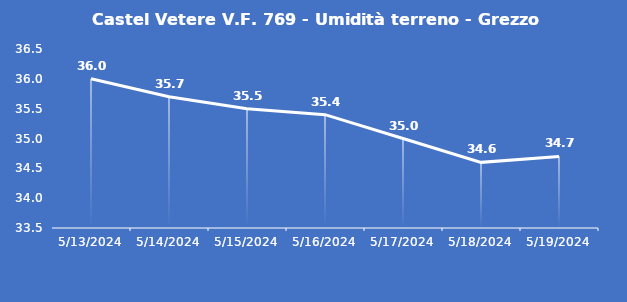
| Category | Castel Vetere V.F. 769 - Umidità terreno - Grezzo (%VWC) |
|---|---|
| 5/13/24 | 36 |
| 5/14/24 | 35.7 |
| 5/15/24 | 35.5 |
| 5/16/24 | 35.4 |
| 5/17/24 | 35 |
| 5/18/24 | 34.6 |
| 5/19/24 | 34.7 |